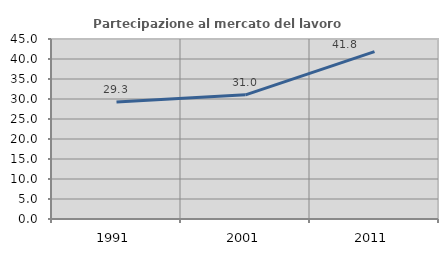
| Category | Partecipazione al mercato del lavoro  femminile |
|---|---|
| 1991.0 | 29.252 |
| 2001.0 | 31.034 |
| 2011.0 | 41.844 |